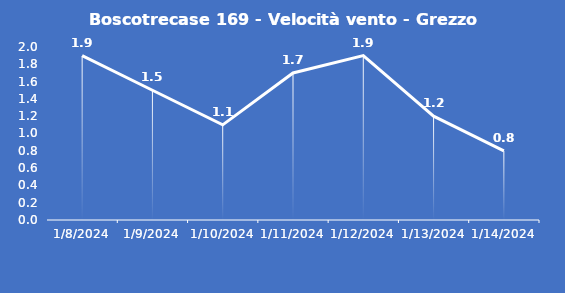
| Category | Boscotrecase 169 - Velocità vento - Grezzo (m/s) |
|---|---|
| 1/8/24 | 1.9 |
| 1/9/24 | 1.5 |
| 1/10/24 | 1.1 |
| 1/11/24 | 1.7 |
| 1/12/24 | 1.9 |
| 1/13/24 | 1.2 |
| 1/14/24 | 0.8 |